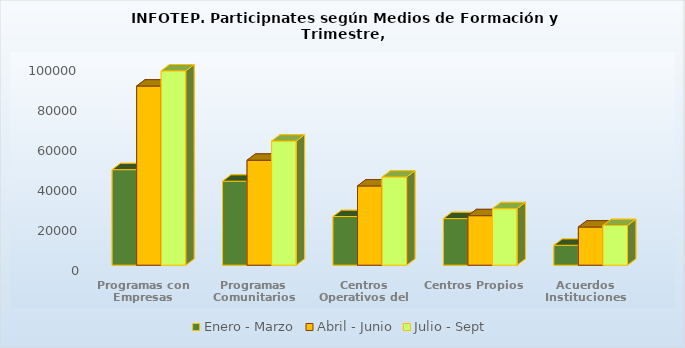
| Category | Enero - Marzo | Abril - Junio | Julio - Sept |
|---|---|---|---|
| Programas con Empresas | 47746 | 89521 | 97090 |
| Programas Comunitarios | 41966 | 52444 | 62013 |
| Centros Operativos del Sistema | 24310 | 39603 | 44062 |
| Centros Propios | 23290 | 24738 | 28245 |
| Acuerdos Instituciones | 9954 | 19069 | 19820 |